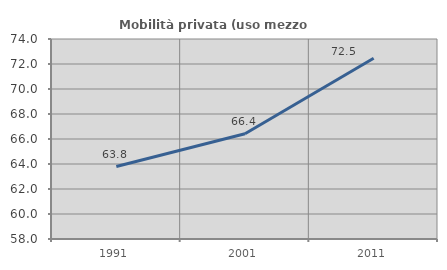
| Category | Mobilità privata (uso mezzo privato) |
|---|---|
| 1991.0 | 63.795 |
| 2001.0 | 66.42 |
| 2011.0 | 72.464 |